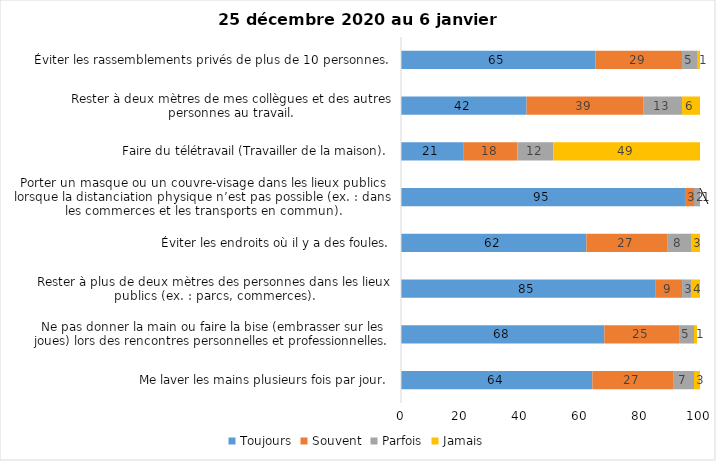
| Category | Toujours | Souvent | Parfois | Jamais |
|---|---|---|---|---|
| Me laver les mains plusieurs fois par jour. | 64 | 27 | 7 | 3 |
| Ne pas donner la main ou faire la bise (embrasser sur les joues) lors des rencontres personnelles et professionnelles. | 68 | 25 | 5 | 1 |
| Rester à plus de deux mètres des personnes dans les lieux publics (ex. : parcs, commerces). | 85 | 9 | 3 | 4 |
| Éviter les endroits où il y a des foules. | 62 | 27 | 8 | 3 |
| Porter un masque ou un couvre-visage dans les lieux publics lorsque la distanciation physique n’est pas possible (ex. : dans les commerces et les transports en commun). | 95 | 3 | 2 | 1 |
| Faire du télétravail (Travailler de la maison). | 21 | 18 | 12 | 49 |
| Rester à deux mètres de mes collègues et des autres personnes au travail. | 42 | 39 | 13 | 6 |
| Éviter les rassemblements privés de plus de 10 personnes. | 65 | 29 | 5 | 1 |